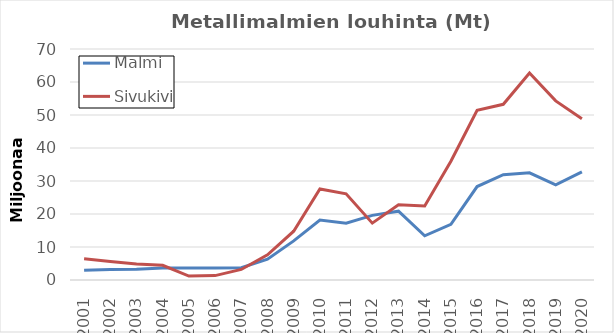
| Category | Malmi | Sivukivi |
|---|---|---|
| 2001.0 | 2940334 | 6407556 |
| 2002.0 | 3185150 | 5633118 |
| 2003.0 | 3243608 | 4861766 |
| 2004.0 | 3636679 | 4468049 |
| 2005.0 | 3623531 | 1184134 |
| 2006.0 | 3605223 | 1335217 |
| 2007.0 | 3732900 | 3198445 |
| 2008.0 | 6311123 | 7608208 |
| 2009.0 | 11845051 | 14795402 |
| 2010.0 | 18191462 | 27590444 |
| 2011.0 | 17213074 | 26113162 |
| 2012.0 | 19591999 | 17232758 |
| 2013.0 | 20846551 | 22786745 |
| 2014.0 | 13403495 | 22414874 |
| 2015.0 | 16869885 | 36009984 |
| 2016.0 | 28314264 | 51446976 |
| 2017.0 | 31914672 | 53238495 |
| 2018.0 | 32468824 | 62709145 |
| 2019.0 | 28853582 | 54276992 |
| 2020.0 | 32784291 | 48898985 |